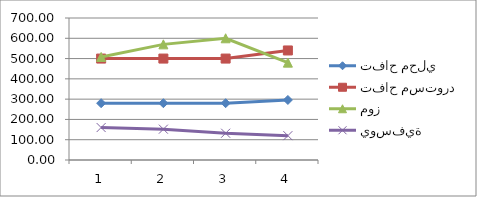
| Category | تفاح محلي | تفاح مستورد | موز | يوسفية |
|---|---|---|---|---|
| 0 | 280 | 500 | 508 | 160 |
| 1 | 280 | 500 | 570 | 152 |
| 2 | 280 | 500 | 600 | 132 |
| 3 | 296 | 540 | 480 | 120 |